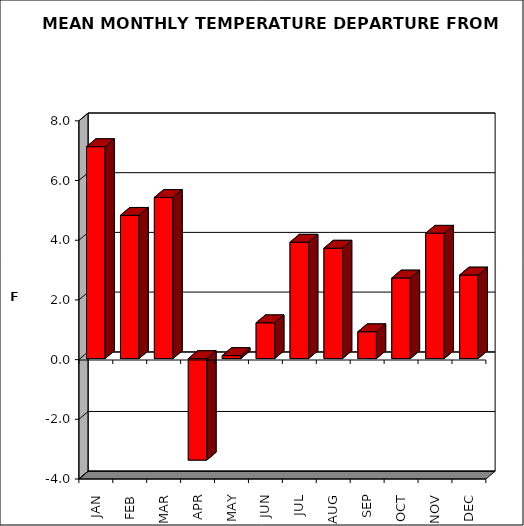
| Category | Series 0 |
|---|---|
| JAN | 7.1 |
| FEB | 4.8 |
| MAR | 5.4 |
| APR | -3.4 |
| MAY | 0.1 |
| JUN | 1.2 |
| JUL | 3.9 |
| AUG | 3.7 |
| SEP | 0.9 |
| OCT | 2.7 |
| NOV | 4.2 |
| DEC | 2.8 |